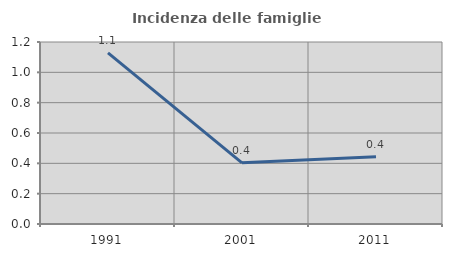
| Category | Incidenza delle famiglie numerose |
|---|---|
| 1991.0 | 1.128 |
| 2001.0 | 0.404 |
| 2011.0 | 0.443 |